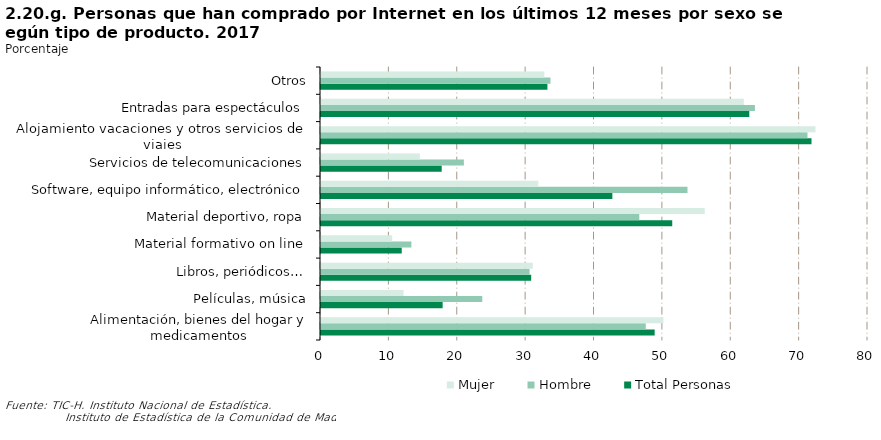
| Category | Total Personas | Hombre | Mujer |
|---|---|---|---|
| Alimentación, bienes del hogar y medicamentos | 48.799 | 47.498 | 50.083 |
| Películas, música | 17.79 | 23.589 | 12.071 |
| Libros, periódicos… | 30.74 | 30.506 | 30.971 |
| Material formativo on line | 11.807 | 13.219 | 10.414 |
| Material deportivo, ropa | 51.369 | 46.553 | 56.12 |
| Software, equipo informático, electrónico | 42.614 | 53.598 | 31.778 |
| Servicios de telecomunicaciones | 17.653 | 20.897 | 14.453 |
| Alojamiento vacaciones y otros servicios de viajes | 71.738 | 71.148 | 72.32 |
| Entradas para espectáculos | 62.639 | 63.459 | 61.831 |
| Otros | 33.112 | 33.561 | 32.668 |